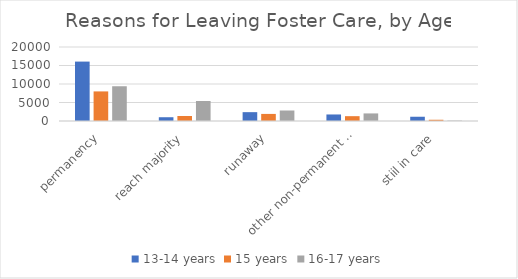
| Category | 13-14 years | 15 years | 16-17 years |
|---|---|---|---|
| permanency | 16058 | 7997 | 9392 |
| reach majority | 1019 | 1352 | 5405 |
| runaway | 2392 | 1915 | 2838 |
| other non-permanent exit | 1765 | 1305 | 2048 |
| stiil in care | 1151 | 335 | 110 |